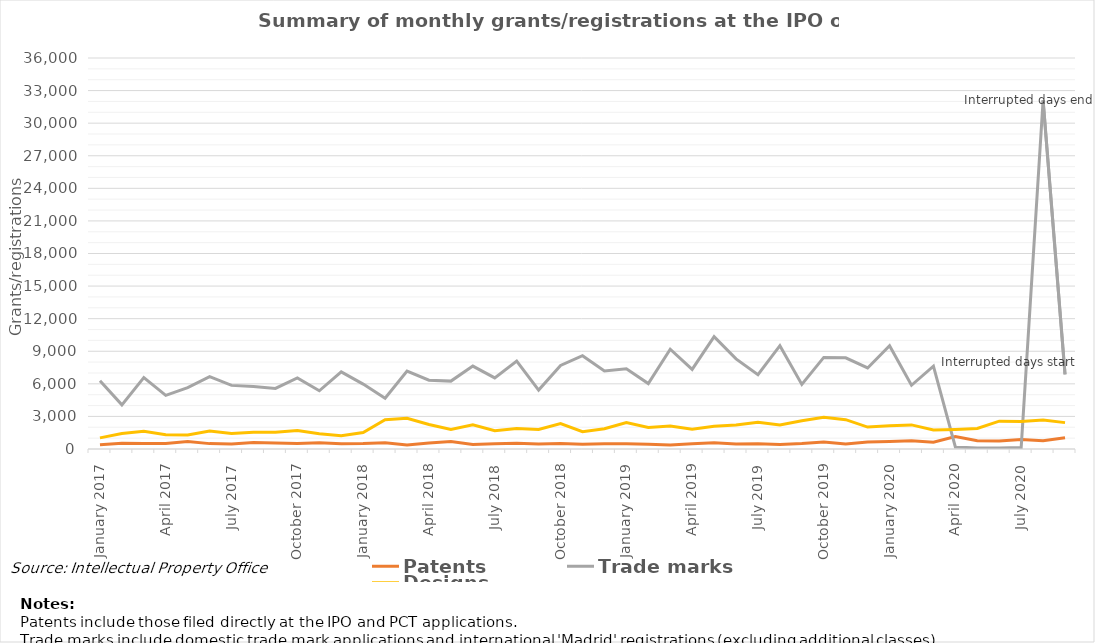
| Category | Patents | Trade marks | Designs |
|---|---|---|---|
| January 2017 | 387 | 6287 | 1026 |
| February 2017 | 533 | 4063 | 1420 |
| March 2017 | 505 | 6576 | 1631 |
| April 2017 | 516 | 4937 | 1318 |
| May 2017 | 681 | 5651 | 1284 |
| June 2017 | 495 | 6658 | 1660 |
| July 2017 | 466 | 5857 | 1437 |
| August 2017 | 592 | 5763 | 1550 |
| September 2017 | 554 | 5578 | 1553 |
| October 2017 | 517 | 6538 | 1705 |
| November 2017 | 578 | 5362 | 1397 |
| December 2017 | 487 | 7101 | 1218 |
| January 2018 | 495 | 5977 | 1512 |
| February 2018 | 574 | 4670 | 2704 |
| March 2018 | 370 | 7176 | 2825 |
| April 2018 | 543 | 6332 | 2259 |
| May 2018 | 690 | 6251 | 1789 |
| June 2018 | 424 | 7636 | 2222 |
| July 2018 | 486 | 6546 | 1678 |
| August 2018 | 536 | 8099 | 1878 |
| September 2018 | 450 | 5426 | 1795 |
| October 2018 | 498 | 7698 | 2348 |
| November 2018 | 432 | 8590 | 1592 |
| December 2018 | 484 | 7188 | 1859 |
| January 2019 | 475 | 7393 | 2444 |
| February 2019 | 426 | 6021 | 1987 |
| March 2019 | 363 | 9184 | 2125 |
| April 2019 | 488 | 7333 | 1810 |
| May 2019 | 573 | 10342 | 2096 |
| June 2019 | 471 | 8301 | 2202 |
| July 2019 | 489 | 6839 | 2464 |
| August 2019 | 420 | 9513 | 2219 |
| September 2019 | 500 | 5942 | 2596 |
| October 2019 | 634 | 8434 | 2926 |
| November 2019 | 455 | 8397 | 2700 |
| December 2019 | 654 | 7464 | 2021 |
| January 2020 | 696 | 9501 | 2145 |
| February 2020 | 756 | 5867 | 2220 |
| March 2020 | 622 | 7622 | 1758 |
| April 2020 | 1143 | 190 | 1803 |
| May 2020 | 768 | 103 | 1888 |
| June 2020 | 740 | 101 | 2566 |
| July 2020 | 878 | 129 | 2539 |
| August 2020 | 771 | 32107 | 2666 |